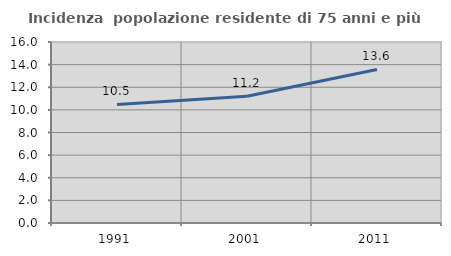
| Category | Incidenza  popolazione residente di 75 anni e più |
|---|---|
| 1991.0 | 10.485 |
| 2001.0 | 11.198 |
| 2011.0 | 13.573 |